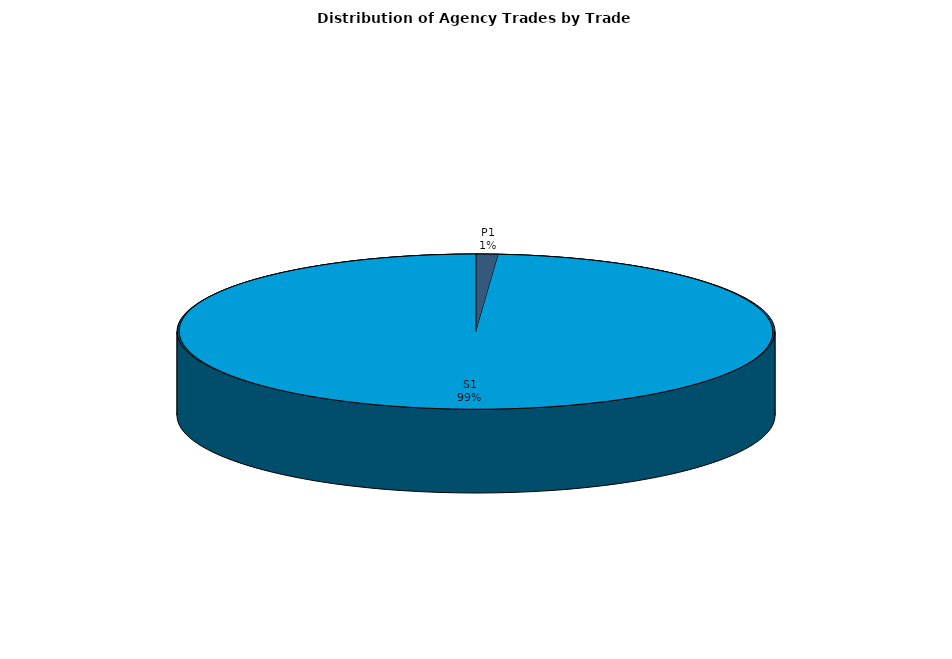
| Category | Series 0 |
|---|---|
| P1 | 36.633 |
| S1 | 3010.51 |